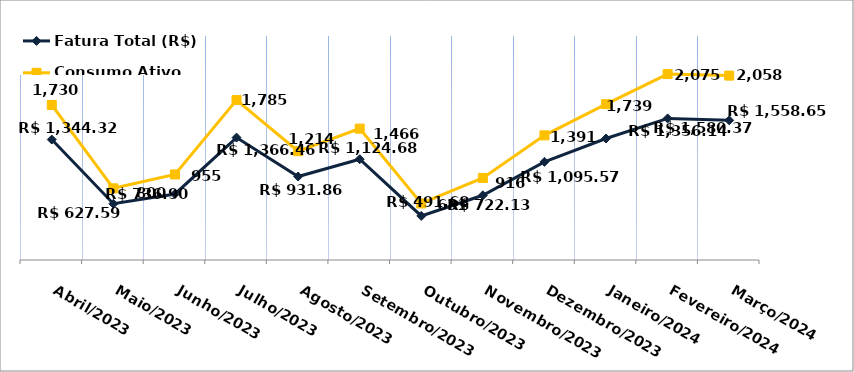
| Category | Fatura Total (R$) |
|---|---|
| Abril/2023 | 1344.32 |
| Maio/2023 | 627.59 |
| Junho/2023 | 736.9 |
| Julho/2023 | 1366.46 |
| Agosto/2023 | 931.86 |
| Setembro/2023 | 1124.68 |
| Outubro/2023 | 491.68 |
| Novembro/2023 | 722.13 |
| Dezembro/2023 | 1095.57 |
| Janeiro/2024 | 1356.14 |
| Fevereiro/2024 | 1580.37 |
| Março/2024 | 1558.65 |